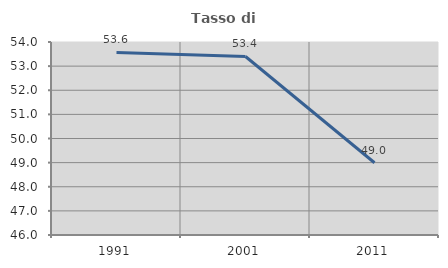
| Category | Tasso di occupazione   |
|---|---|
| 1991.0 | 53.568 |
| 2001.0 | 53.4 |
| 2011.0 | 48.996 |